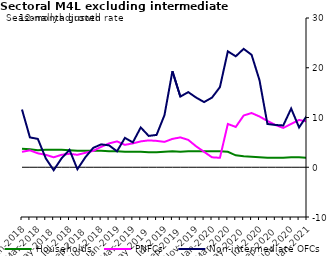
| Category | zero | Households | PNFCs | Non-intermediate OFCs |
|---|---|---|---|---|
| Jan-2018 | 0 | 3.7 | 3.1 | 11.6 |
| Feb-2018 | 0 | 3.6 | 3.4 | 6 |
| Mar-2018 | 0 | 3.4 | 2.8 | 5.7 |
| Apr-2018 | 0 | 3.5 | 2.5 | 1.8 |
| May-2018 | 0 | 3.5 | 2 | -0.6 |
| Jun-2018 | 0 | 3.5 | 2.5 | 1.8 |
| Jul-2018 | 0 | 3.4 | 2.7 | 3.5 |
| Aug-2018 | 0 | 3.3 | 2.5 | -0.4 |
| Sep-2018 | 0 | 3.3 | 2.9 | 2 |
| Oct-2018 | 0 | 3.3 | 3.3 | 3.9 |
| Nov-2018 | 0 | 3.3 | 4.1 | 4.6 |
| Dec-2018 | 0 | 3.2 | 4.8 | 4.4 |
| Jan-2019 | 0 | 3.2 | 5.2 | 3.2 |
| Feb-2019 | 0 | 3.1 | 4.5 | 5.9 |
| Mar-2019 | 0 | 3.1 | 4.8 | 5 |
| Apr-2019 | 0 | 3.1 | 5.2 | 8 |
| May-2019 | 0 | 3 | 5.4 | 6.3 |
| Jun-2019 | 0 | 3 | 5.3 | 6.5 |
| Jul-2019 | 0 | 3.1 | 5.1 | 10.5 |
| Aug-2019 | 0 | 3.2 | 5.7 | 19.3 |
| Sep-2019 | 0 | 3.1 | 6 | 14.2 |
| Oct-2019 | 0 | 3.2 | 5.5 | 15.1 |
| Nov-2019 | 0 | 3.2 | 4.2 | 14 |
| Dec-2019 | 0 | 3.2 | 3.1 | 13.1 |
| Jan-2020 | 0 | 3.2 | 2 | 14 |
| Feb-2020 | 0 | 3.2 | 1.9 | 16.1 |
| Mar-2020 | 0 | 3.1 | 8.7 | 23.3 |
| Apr-2020 | 0 | 2.4 | 8.1 | 22.3 |
| May-2020 | 0 | 2.2 | 10.4 | 23.8 |
| Jun-2020 | 0 | 2.1 | 10.9 | 22.6 |
| Jul-2020 | 0 | 2 | 10.2 | 17.5 |
| Aug-2020 | 0 | 1.9 | 9.3 | 8.7 |
| Sep-2020 | 0 | 1.9 | 8.5 | 8.5 |
| Oct-2020 | 0 | 1.9 | 7.9 | 8.4 |
| Nov-2020 | 0 | 2 | 8.7 | 11.8 |
| Dec-2020 | 0 | 2 | 9.5 | 8 |
| Jan-2021 | 0 | 1.9 | 9.2 | 10.4 |